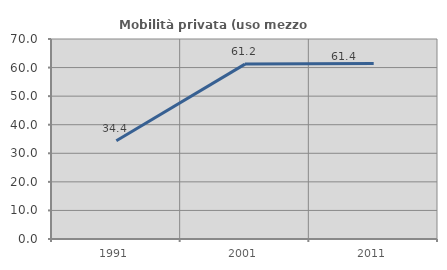
| Category | Mobilità privata (uso mezzo privato) |
|---|---|
| 1991.0 | 34.359 |
| 2001.0 | 61.212 |
| 2011.0 | 61.429 |